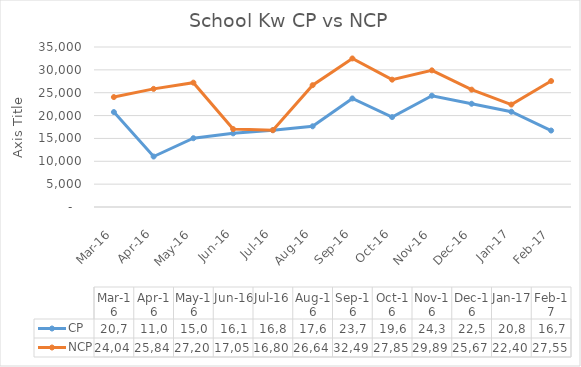
| Category | CP | NCP |
|---|---|---|
| 2016-03-16 | 20766 | 24043 |
| 2016-04-16 | 11039 | 25840 |
| 2016-05-16 | 15046 | 27201 |
| 2016-06-16 | 16111 | 17050 |
| 2016-07-16 | 16803 | 16803 |
| 2016-08-16 | 17654 | 26648 |
| 2016-09-16 | 23740 | 32492 |
| 2016-10-16 | 19669 | 27855 |
| 2016-11-16 | 24345 | 29893 |
| 2016-12-16 | 22585 | 25672 |
| 2017-01-16 | 20839 | 22407 |
| 2017-02-16 | 16727 | 27556 |